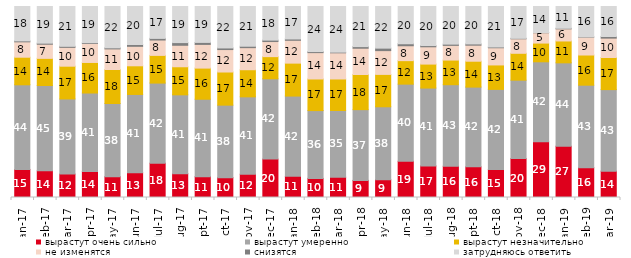
| Category | вырастут очень сильно | вырастут умеренно | вырастут незначительно | не изменятся | снизятся | затрудняюсь ответить |
|---|---|---|---|---|---|---|
| 2017-01-01 | 14.65 | 44.35 | 14.45 | 8.05 | 0.5 | 18 |
| 2017-02-01 | 13.95 | 44.7 | 14.2 | 7.4 | 0.55 | 19.2 |
| 2017-03-01 | 12.25 | 39.35 | 17.15 | 9.85 | 0.55 | 20.85 |
| 2017-04-01 | 13.55 | 41.15 | 16 | 9.95 | 0.4 | 18.95 |
| 2017-05-01 | 10.9 | 38.3 | 17.8 | 10.8 | 0.55 | 21.65 |
| 2017-06-01 | 13 | 40.95 | 15 | 10.2 | 0.95 | 19.9 |
| 2017-07-01 | 17.95 | 41.95 | 14.5 | 8.05 | 0.85 | 16.7 |
| 2017-08-01 | 12.5 | 41.25 | 14.7 | 11.25 | 1.4 | 18.9 |
| 2017-09-01 | 10.9 | 40.55 | 16.3 | 12.4 | 1.05 | 18.8 |
| 2017-10-01 | 10.4 | 37.95 | 17.35 | 11.75 | 0.85 | 21.7 |
| 2017-11-01 | 12.2 | 40.5 | 14.2 | 11.55 | 0.75 | 20.8 |
| 2017-12-01 | 20.1 | 42.05 | 11.6 | 7.9 | 0.75 | 17.6 |
| 2018-01-01 | 11.1 | 42 | 17.25 | 11.95 | 0.7 | 17 |
| 2018-02-01 | 10 | 35.5 | 16.55 | 13.8 | 0.55 | 23.6 |
| 2018-03-01 | 10.65 | 34.9 | 16.5 | 13.7 | 0.35 | 23.9 |
| 2018-04-01 | 8.95 | 37.05 | 18.4 | 13.75 | 0.85 | 21 |
| 2018-05-01 | 9.3 | 38.2 | 16.95 | 12.45 | 1.3 | 21.8 |
| 2018-06-01 | 18.95 | 40.4 | 12.3 | 7.8 | 1.05 | 19.5 |
| 2018-07-01 | 16.55 | 40.75 | 12.55 | 9.05 | 0.65 | 20.45 |
| 2018-08-01 | 16.35 | 42.7 | 12.9 | 7.7 | 0.65 | 19.7 |
| 2018-09-01 | 16.05 | 41.75 | 13.55 | 8.4 | 0.65 | 19.6 |
| 2018-10-01 | 14.6 | 42 | 12.8 | 9 | 0.4 | 21.2 |
| 2018-11-01 | 20.359 | 41.068 | 14.072 | 7.585 | 0.25 | 16.667 |
| 2018-12-01 | 29.25 | 41.8 | 9.8 | 5.4 | 0.1 | 13.65 |
| 2019-01-01 | 26.85 | 43.65 | 11.45 | 6.35 | 0.3 | 11.4 |
| 2019-02-01 | 15.6 | 43.2 | 15.8 | 9.35 | 0.15 | 15.9 |
| 2019-03-01 | 13.774 | 42.715 | 16.808 | 10.144 | 0.845 | 15.714 |